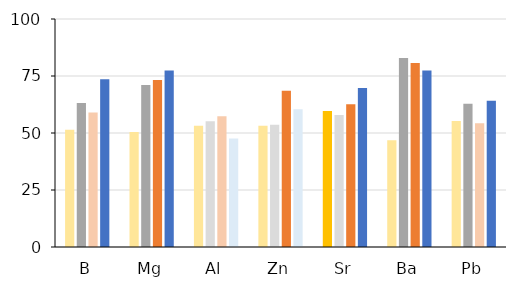
| Category | FO | IOM | ICE | GOM |
|---|---|---|---|---|
| B | 51.376 | 63.158 | 59.016 | 73.585 |
| Mg | 50.459 | 71.053 | 73.239 | 77.358 |
| Al | 53.211 | 55.128 | 57.377 | 47.619 |
| Zn | 53.211 | 53.659 | 68.571 | 60.465 |
| Sr | 59.633 | 57.895 | 62.651 | 69.767 |
| Ba | 46.789 | 82.895 | 80.723 | 77.358 |
| Pb | 55.238 | 62.821 | 54.237 | 64.151 |